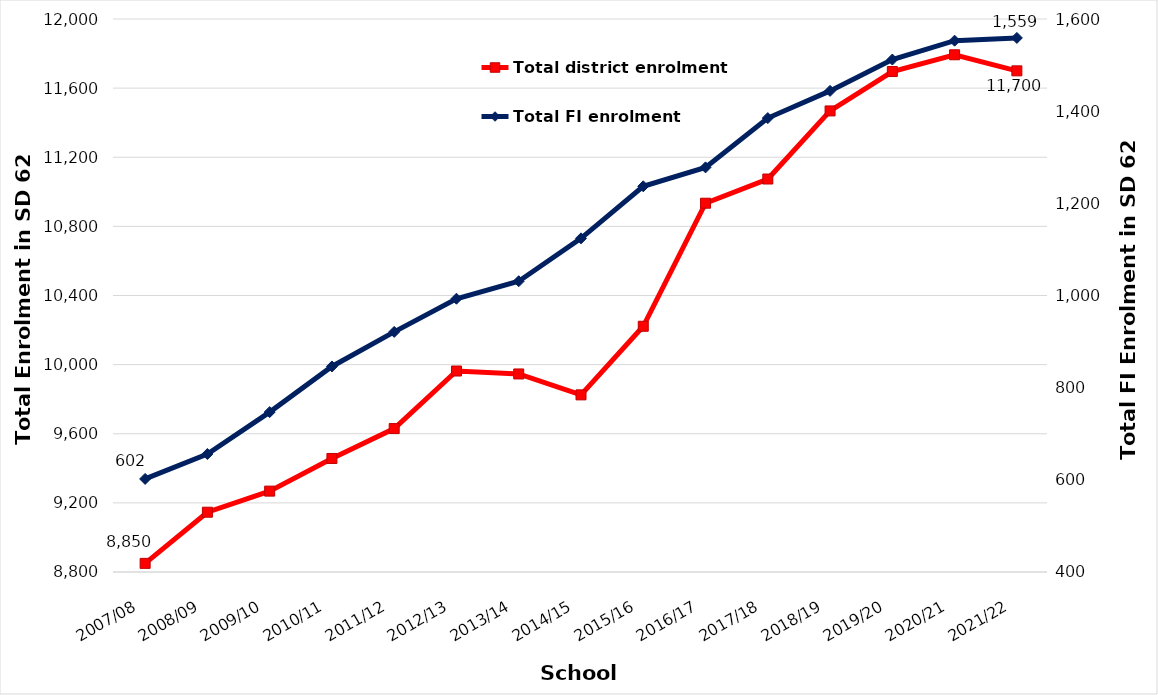
| Category | Total district enrolment  |
|---|---|
| 2007/08 | 8850 |
| 2008/09 | 9146 |
| 2009/10 | 9268 |
| 2010/11 | 9457 |
| 2011/12 | 9630 |
| 2012/13 | 9963 |
| 2013/14 | 9946 |
| 2014/15 | 9825 |
| 2015/16 | 10222 |
| 2016/17 | 10934 |
| 2017/18 | 11074 |
| 2018/19 | 11468 |
| 2019/20 | 11696 |
| 2020/21 | 11793 |
| 2021/22 | 11700 |